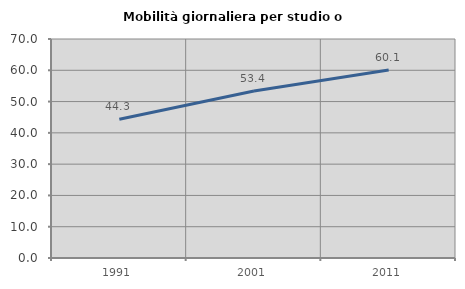
| Category | Mobilità giornaliera per studio o lavoro |
|---|---|
| 1991.0 | 44.338 |
| 2001.0 | 53.358 |
| 2011.0 | 60.111 |